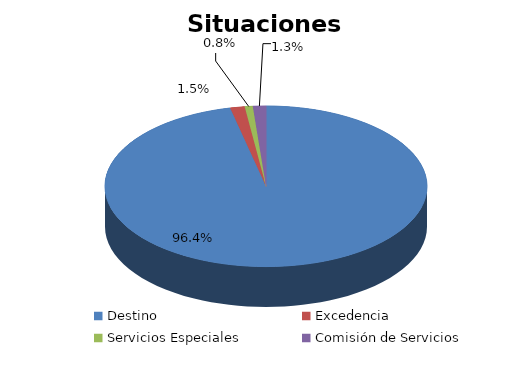
| Category | Series 0 |
|---|---|
| Destino | 2509 |
| Excedencia | 38 |
| Servicios Especiales | 21 |
| Comisión de Servicios | 34 |